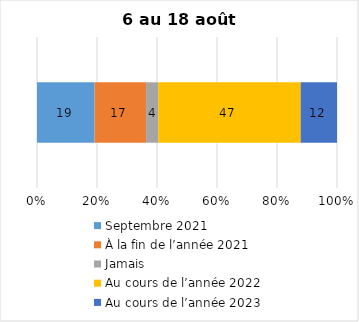
| Category | Septembre 2021 | À la fin de l’année 2021 | Jamais | Au cours de l’année 2022 | Au cours de l’année 2023 |
|---|---|---|---|---|---|
| 0 | 19 | 17 | 4 | 47 | 12 |